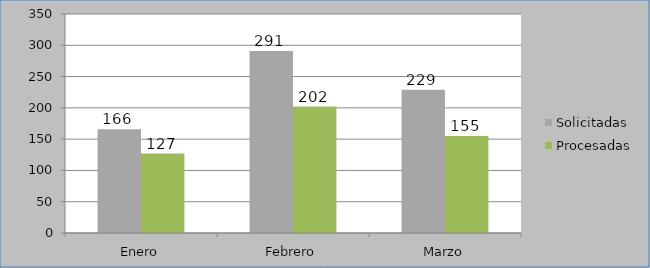
| Category | Solicitadas | Procesadas |
|---|---|---|
| Enero | 166 | 127 |
| Febrero | 291 | 202 |
| Marzo | 229 | 155 |